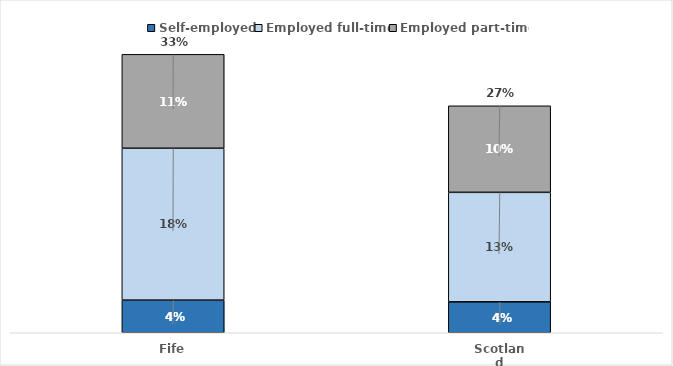
| Category | Self-employed | Employed full-time | Employed part-time |
|---|---|---|---|
| Fife | 0.039 | 0.18 | 0.111 |
| Scotland | 0.037 | 0.13 | 0.103 |